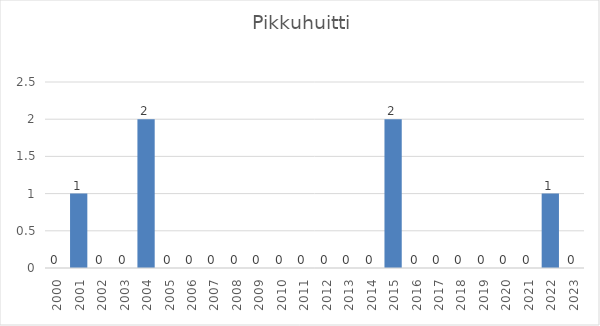
| Category | Series 0 |
|---|---|
| 2000.0 | 0 |
| 2001.0 | 1 |
| 2002.0 | 0 |
| 2003.0 | 0 |
| 2004.0 | 2 |
| 2005.0 | 0 |
| 2006.0 | 0 |
| 2007.0 | 0 |
| 2008.0 | 0 |
| 2009.0 | 0 |
| 2010.0 | 0 |
| 2011.0 | 0 |
| 2012.0 | 0 |
| 2013.0 | 0 |
| 2014.0 | 0 |
| 2015.0 | 2 |
| 2016.0 | 0 |
| 2017.0 | 0 |
| 2018.0 | 0 |
| 2019.0 | 0 |
| 2020.0 | 0 |
| 2021.0 | 0 |
| 2022.0 | 1 |
| 2023.0 | 0 |